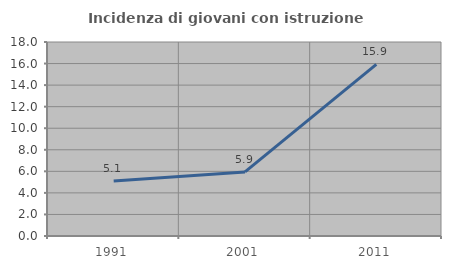
| Category | Incidenza di giovani con istruzione universitaria |
|---|---|
| 1991.0 | 5.112 |
| 2001.0 | 5.949 |
| 2011.0 | 15.917 |